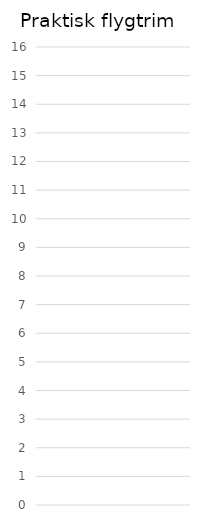
| Category | Ringrostig | I behov av uppfräschning | God flygtrim |
|---|---|---|---|
| 0 | 0 | 0 | 0 |